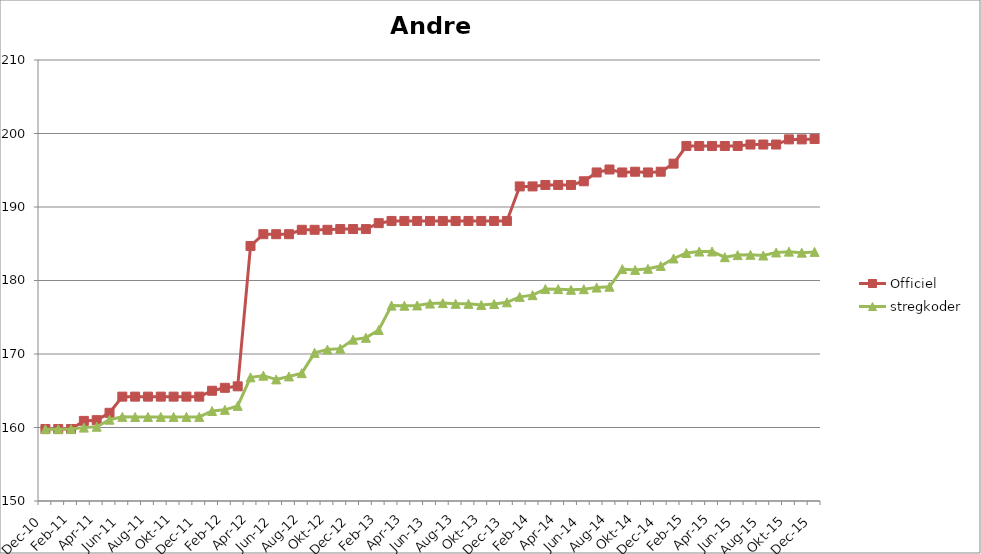
| Category | Officiel | stregkoder |
|---|---|---|
|  Dec-10 | 159.8 | 159.77 |
|  Jan-11 | 159.8 | 159.77 |
|  Feb-11 | 159.8 | 159.785 |
|  Mar-11 | 160.9 | 159.984 |
|  Apr-11 | 161 | 160.101 |
|  Maj-11 | 162 | 161.063 |
|  Jun-11 | 164.2 | 161.446 |
|  Jul-11 | 164.2 | 161.434 |
|  Aug-11 | 164.2 | 161.438 |
|  Sep-11 | 164.2 | 161.439 |
|  Okt-11 | 164.2 | 161.439 |
|  Nov-11 | 164.2 | 161.438 |
|  Dec-11 | 164.2 | 161.44 |
|  Jan-12 | 165 | 162.245 |
|  Feb-12 | 165.4 | 162.4 |
|  Mar-12 | 165.6 | 162.937 |
|  Apr-12 | 184.7 | 166.822 |
|  Maj-12 | 186.3 | 167.053 |
|  Jun-12 | 186.3 | 166.543 |
|  Jul-12 | 186.3 | 166.95 |
|  Aug-12 | 186.9 | 167.392 |
|  Sep-12 | 186.9 | 170.157 |
|  Okt-12 | 186.9 | 170.598 |
|  Nov-12 | 187 | 170.73 |
|  Dec-12 | 187 | 171.956 |
|  Jan-13 | 187 | 172.206 |
|  Feb-13 | 187.8 | 173.262 |
|  Mar-13 | 188.1 | 176.582 |
|  Apr-13 | 188.1 | 176.569 |
|  Maj-13 | 188.1 | 176.603 |
|  Jun-13 | 188.1 | 176.863 |
|  Jul-13 | 188.1 | 176.928 |
|  Aug-13 | 188.1 | 176.826 |
|  Sep-13 | 188.1 | 176.826 |
|  Okt-13 | 188.1 | 176.663 |
|  Nov-13 | 188.1 | 176.8 |
|  Dec-13 | 188.1 | 177.031 |
|  Jan-14 | 192.8 | 177.772 |
|  Feb-14 | 192.8 | 178.005 |
|  Mar-14 | 193 | 178.834 |
|  Apr-14 | 193 | 178.826 |
|  Maj-14 | 193 | 178.733 |
|  Jun-14 | 193.5 | 178.813 |
|  Jul-14 | 194.7 | 179.038 |
|  Aug-14 | 195.1 | 179.151 |
|  Sep-14 | 194.7 | 181.553 |
|  Okt-14 | 194.8 | 181.442 |
|  Nov-14 | 194.7 | 181.59 |
|  Dec-14 | 194.8 | 181.971 |
|  Jan-15 | 195.9 | 182.996 |
|  Feb-15 | 198.3 | 183.74 |
|  Mar-15 | 198.3 | 183.941 |
|  Apr-15 | 198.3 | 183.945 |
|  Maj-15 | 198.3 | 183.172 |
| Jun-15 | 198.3 | 183.458 |
| Jul-15 | 198.5 | 183.49 |
| Aug-15 | 198.5 | 183.402 |
| Sep-15 | 198.5 | 183.82 |
| Okt-15 | 199.2 | 183.928 |
| Nov-15 | 199.2 | 183.788 |
| Dec-15 | 199.246 | 183.89 |